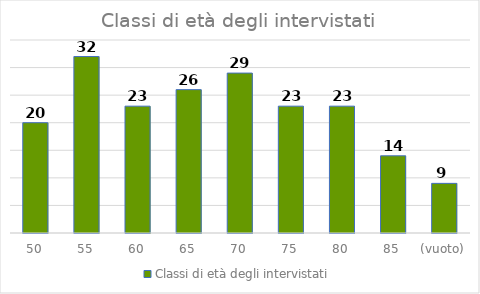
| Category | Classi di età degli intervistati |
|---|---|
| 50 | 20 |
| 55 | 32 |
| 60 | 23 |
| 65 | 26 |
| 70 | 29 |
| 75 | 23 |
| 80 | 23 |
| 85 | 14 |
| (vuoto) | 9 |